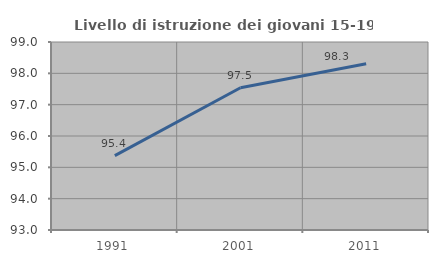
| Category | Livello di istruzione dei giovani 15-19 anni |
|---|---|
| 1991.0 | 95.373 |
| 2001.0 | 97.54 |
| 2011.0 | 98.307 |